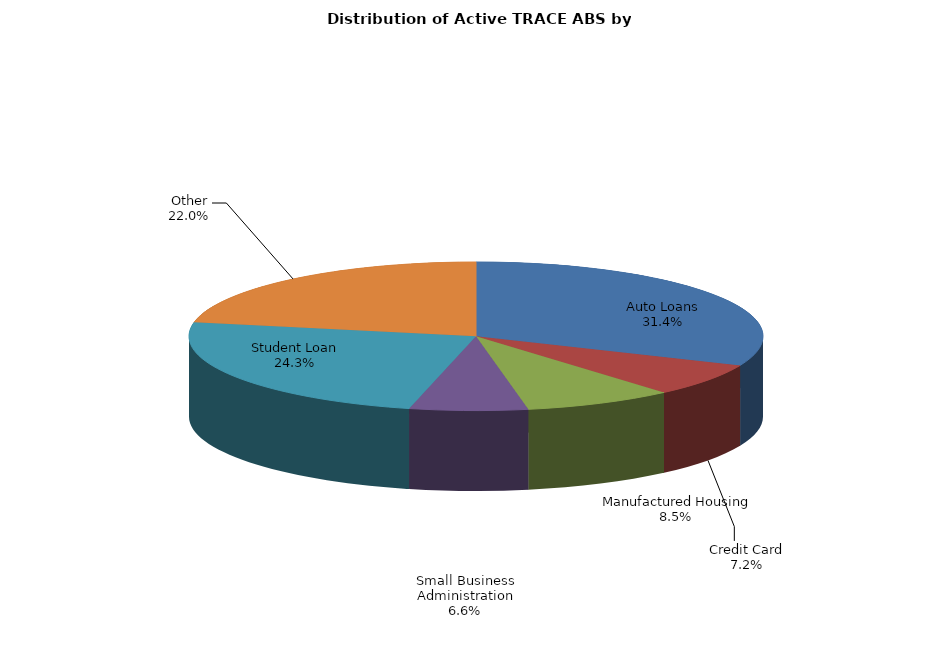
| Category | Series 0 |
|---|---|
| Auto Loans | 1568 |
| Credit Card | 361 |
| Manufactured Housing | 422 |
| Small Business Administration | 332 |
| Student Loan | 1212 |
| Other | 1098 |